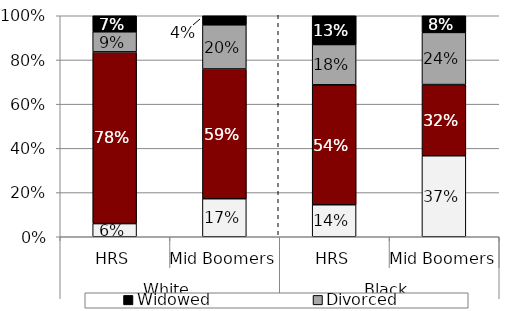
| Category | Not married | Married | Divorced | Widowed |
|---|---|---|---|---|
| 0 | 0.06 | 0.777 | 0.091 | 0.073 |
| 1 | 0.172 | 0.587 | 0.2 | 0.041 |
| 2 | 0.145 | 0.543 | 0.182 | 0.13 |
| 3 | 0.366 | 0.322 | 0.236 | 0.075 |